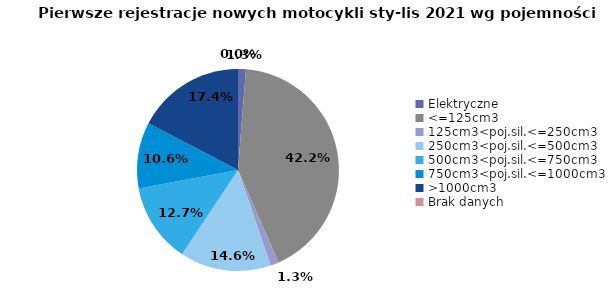
| Category | Series 0 |
|---|---|
| Elektryczne | 272 |
| <=125cm3 | 9097 |
| 125cm3<poj.sil.<=250cm3 | 290 |
| 250cm3<poj.sil.<=500cm3 | 3145 |
| 500cm3<poj.sil.<=750cm3 | 2748 |
| 750cm3<poj.sil.<=1000cm3 | 2283 |
| >1000cm3 | 3744 |
| Brak danych | 0 |